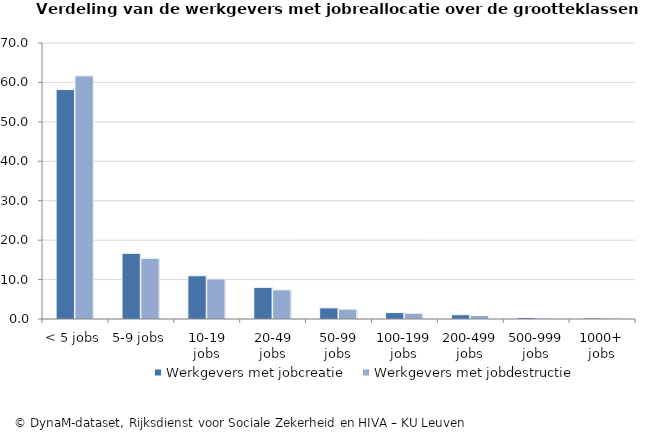
| Category | Werkgevers met jobcreatie | Werkgevers met jobdestructie |
|---|---|---|
| < 5 jobs | 58.188 | 61.675 |
| 5-9 jobs | 16.651 | 15.39 |
| 10-19 jobs | 10.967 | 10.167 |
| 20-49 jobs | 8.019 | 7.393 |
| 50-99 jobs | 2.827 | 2.51 |
| 100-199 jobs | 1.623 | 1.473 |
| 200-499 jobs | 1.081 | 0.885 |
| 500-999 jobs | 0.368 | 0.248 |
| 1000+ jobs | 0.277 | 0.259 |